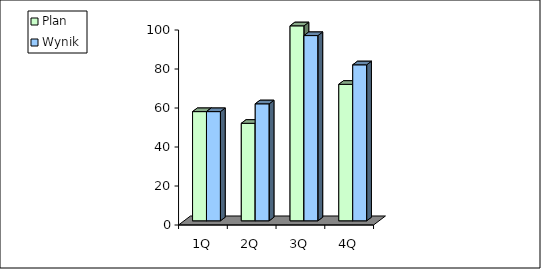
| Category | Plan | Wynik |
|---|---|---|
| 1Q | 56 | 56 |
| 2Q | 50 | 60 |
| 3Q | 100 | 95 |
| 4Q | 70 | 80 |